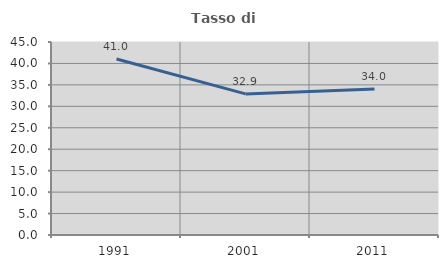
| Category | Tasso di occupazione   |
|---|---|
| 1991.0 | 41.02 |
| 2001.0 | 32.9 |
| 2011.0 | 34.046 |